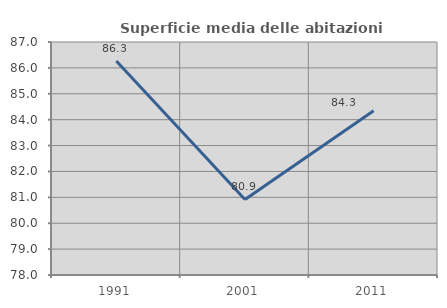
| Category | Superficie media delle abitazioni occupate |
|---|---|
| 1991.0 | 86.268 |
| 2001.0 | 80.918 |
| 2011.0 | 84.347 |